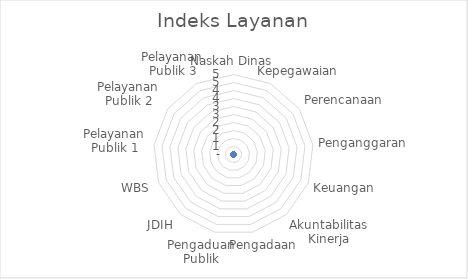
| Category | Series 0 |
|---|---|
| Naskah Dinas | 0 |
| Kepegawaian | 0 |
| Perencanaan | 0 |
| Penganggaran | 0 |
| Keuangan | 0 |
| Akuntabilitas Kinerja | 0 |
| Pengadaan | 0 |
| Pengaduan Publik | 0 |
| JDIH | 0 |
| WBS | 0 |
| Pelayanan Publik 1 | 0 |
| Pelayanan Publik 2 | 0 |
| Pelayanan Publik 3 | 0 |